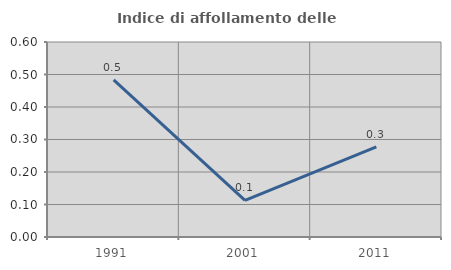
| Category | Indice di affollamento delle abitazioni  |
|---|---|
| 1991.0 | 0.484 |
| 2001.0 | 0.113 |
| 2011.0 | 0.277 |